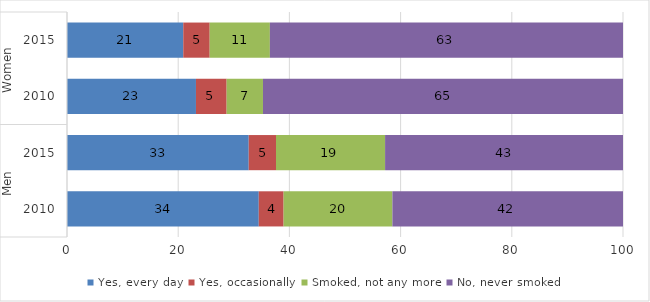
| Category | Yes, every day | Yes, occasionally | Smoked, not any more | No, never smoked |
|---|---|---|---|---|
| 0 | 34.491 | 4.466 | 19.567 | 41.476 |
| 1 | 32.685 | 4.905 | 19.62 | 42.791 |
| 2 | 23.196 | 5.517 | 6.535 | 64.752 |
| 3 | 20.91 | 4.755 | 10.824 | 63.511 |